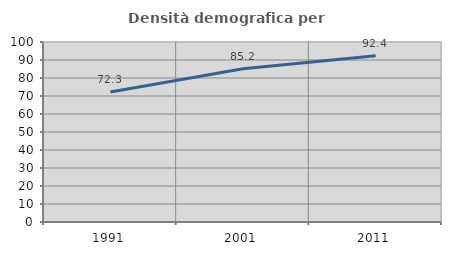
| Category | Densità demografica |
|---|---|
| 1991.0 | 72.272 |
| 2001.0 | 85.183 |
| 2011.0 | 92.396 |